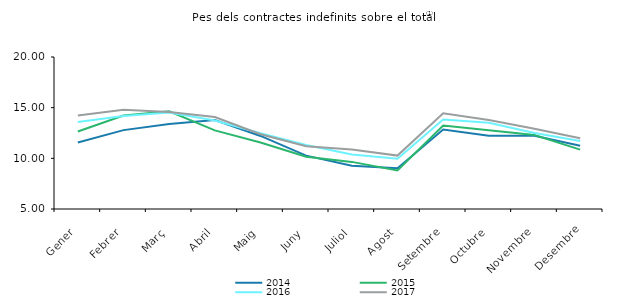
| Category | 2014 | 2015 | 2016 | 2017 |
|---|---|---|---|---|
| Gener | 11.558 | 12.648 | 13.583 | 14.221 |
| Febrer | 12.785 | 14.217 | 14.183 | 14.802 |
| Març | 13.382 | 14.648 | 14.534 | 14.578 |
| Abril | 13.786 | 12.755 | 13.742 | 14.074 |
| Maig | 12.21 | 11.561 | 12.469 | 12.379 |
| Juny | 10.268 | 10.162 | 11.317 | 11.193 |
| Juliol | 9.277 | 9.65 | 10.375 | 10.867 |
| Agost | 9.015 | 8.797 | 9.962 | 10.27 |
| Setembre | 12.837 | 13.241 | 13.823 | 14.448 |
| Octubre | 12.239 | 12.777 | 13.518 | 13.778 |
| Novembre | 12.219 | 12.295 | 12.499 | 12.926 |
| Desembre | 11.235 | 10.861 | 11.702 | 11.985 |